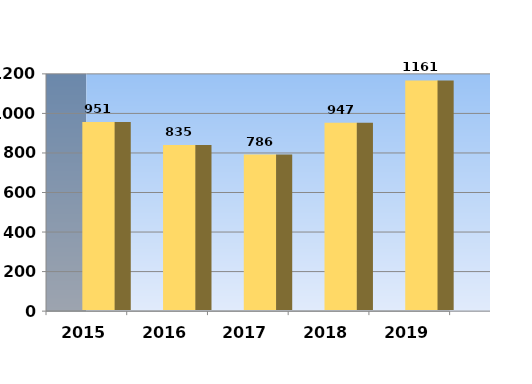
| Category | Series 0 |
|---|---|
| 2015.0 | 951 |
| 2016.0 | 835 |
| 2017.0 | 786 |
| 2018.0 | 947 |
| 2019.0 | 1161 |